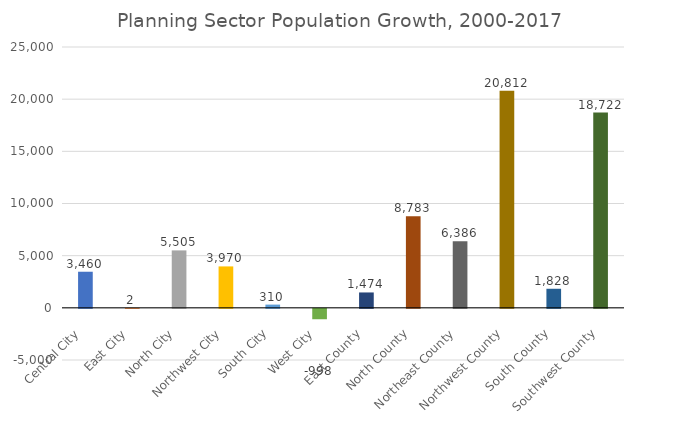
| Category | Total population |
|---|---|
| Central City  | 3460 |
| East City  | 2 |
| North City  | 5505 |
| Northwest City  | 3970 |
| South City  | 310 |
| West City  | -998 |
| East County  | 1474 |
| North County  | 8783 |
| Northeast County  | 6386 |
| Northwest County  | 20812 |
| South County  | 1828 |
| Southwest County  | 18722 |